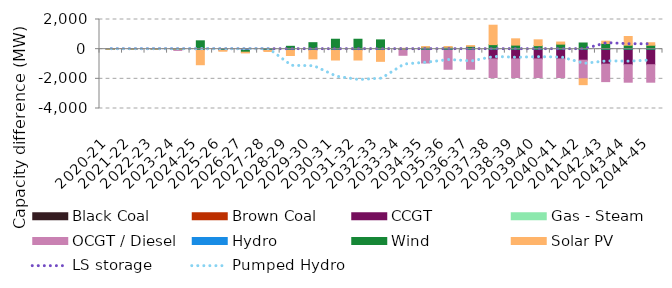
| Category | Black Coal | Brown Coal | CCGT | Gas - Steam | OCGT / Diesel | Hydro | Wind | Solar PV |
|---|---|---|---|---|---|---|---|---|
| 2020-21 | 0 | 0 | 0 | 0 | 0 | 0 | 0.011 | 0.004 |
| 2021-22 | 0 | 0 | 0 | 0 | 0 | 0 | 0.011 | 0.005 |
| 2022-23 | 0 | 0 | 0.001 | 0 | 0.003 | 0 | 0.011 | 0.005 |
| 2023-24 | 0 | 0 | 0.001 | 0 | -84.842 | 0 | 4.099 | 0.008 |
| 2024-25 | 0 | 0 | 0.001 | 0 | -84.842 | 0 | 563.08 | -964.115 |
| 2025-26 | 0 | 0 | 0.001 | 0 | -84.842 | 0 | 4.156 | -54.39 |
| 2026-27 | 0 | 0 | 0.001 | 0 | -84.842 | 0 | -117.973 | -50.119 |
| 2027-28 | 0 | 0 | 0.001 | 0 | -84.842 | 0 | 21.478 | -70.604 |
| 2028-29 | 0 | 0 | 0.001 | 0 | -84.841 | 0 | 192.858 | -341.082 |
| 2029-30 | 0 | 0 | 0.001 | 0 | -84.841 | 0 | 437.801 | -568.96 |
| 2030-31 | 0 | 0 | 0.001 | 0 | -84.841 | 0 | 669.043 | -646.239 |
| 2031-32 | 0 | 0 | 0.001 | 0 | -84.841 | 0 | 669.044 | -646.239 |
| 2032-33 | 0 | 0 | 0.001 | 0 | -84.841 | 0 | 625.672 | -735.784 |
| 2033-34 | 0 | 0 | 0.001 | 0 | -411.95 | 0 | 9.596 | 48.125 |
| 2034-35 | 0 | 0 | 0.001 | 0 | -931.667 | 0 | 127.17 | 48.125 |
| 2035-36 | 0 | 0 | 0.001 | 0 | -1353.766 | 0 | 127.17 | 48.125 |
| 2036-37 | 0 | 0 | 0.001 | 0 | -1353.766 | 0 | 190.005 | 48.125 |
| 2037-38 | 0 | 0 | -657.876 | 0 | -1254.501 | 0 | 305.75 | 1308.897 |
| 2038-39 | 0 | 0 | -657.876 | 0 | -1254.501 | 0 | 273.366 | 424.298 |
| 2039-40 | 0 | 0 | -657.876 | 0 | -1254.501 | 0 | 235.628 | 393.669 |
| 2040-41 | 0 | 0 | -657.876 | 0 | -1254.5 | 0 | 337.956 | 142.261 |
| 2041-42 | 0 | 0 | -742.952 | 0 | -1254.5 | 0 | 416.403 | -394.981 |
| 2042-43 | 0 | 0 | -1009.259 | 0 | -1178.518 | 0 | 384.673 | 153.721 |
| 2043-44 | 0 | 0 | -1048.318 | 0 | -1178.517 | 0 | 267.868 | 584.482 |
| 2044-45 | 0 | 0 | -1048.318 | 0 | -1178.513 | 0 | 265.261 | 168.746 |